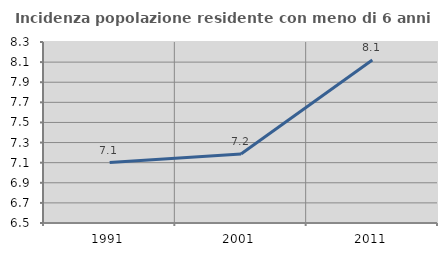
| Category | Incidenza popolazione residente con meno di 6 anni |
|---|---|
| 1991.0 | 7.101 |
| 2001.0 | 7.186 |
| 2011.0 | 8.122 |